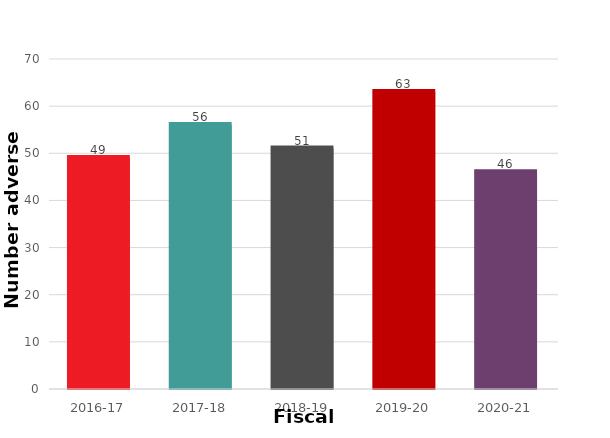
| Category | Number adverse reactions |
|---|---|
| 2016-17 | 49 |
| 2017-18 | 56 |
| 2018-19 | 51 |
| 2019-20 | 63 |
| 2020-21 | 46 |